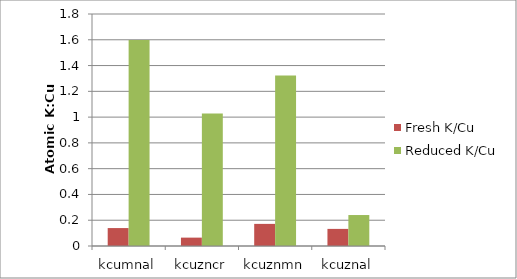
| Category | Fresh K/Cu | Reduced K/Cu |
|---|---|---|
| kcumnal | 0.139 | 1.598 |
| kcuzncr | 0.065 | 1.028 |
| kcuznmn | 0.172 | 1.323 |
| kcuznal | 0.133 | 0.24 |